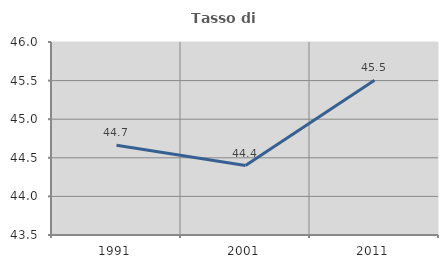
| Category | Tasso di occupazione   |
|---|---|
| 1991.0 | 44.663 |
| 2001.0 | 44.399 |
| 2011.0 | 45.503 |